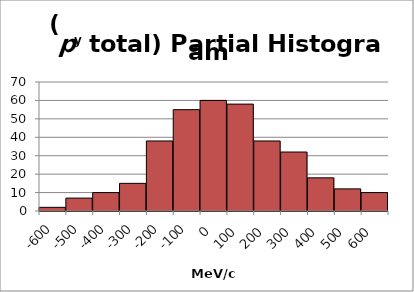
| Category | Series 1 |
|---|---|
| -600.0 | 2 |
| -500.0 | 7 |
| -400.0 | 10 |
| -300.0 | 15 |
| -200.0 | 38 |
| -100.0 | 55 |
| 0.0 | 60 |
| 100.0 | 58 |
| 200.0 | 38 |
| 300.0 | 32 |
| 400.0 | 18 |
| 500.0 | 12 |
| 600.0 | 10 |